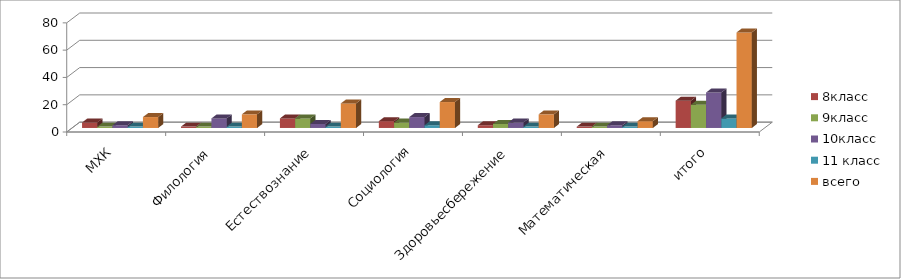
| Category | Series 0 | 8класс | 9класс | 10класс | 11 класс | всего |
|---|---|---|---|---|---|---|
| МХК |  | 4 | 1 | 2 | 1 | 8 |
| Филология |  | 1 | 1 | 7 | 1 | 10 |
| Естествознание |  | 7 | 7 | 3 | 1 | 18 |
| Социология |  | 5 | 4 | 8 | 2 | 19 |
| Здоровьесбережение |  | 2 | 3 | 4 | 1 | 10 |
| Математическая |  | 1 | 1 | 2 | 1 | 5 |
| итого |  | 20 | 17 | 26 | 7 | 70 |